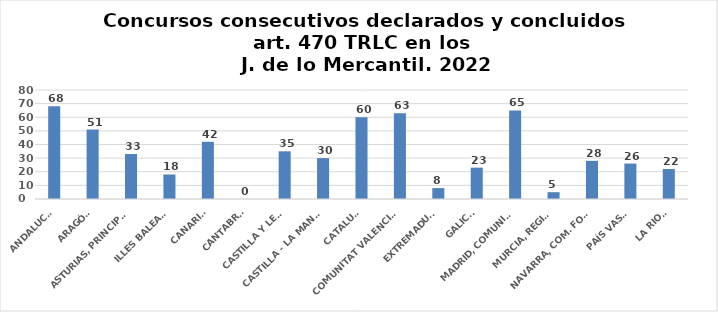
| Category | Series 0 |
|---|---|
| ANDALUCÍA | 68 |
| ARAGÓN | 51 |
| ASTURIAS, PRINCIPADO | 33 |
| ILLES BALEARS | 18 |
| CANARIAS | 42 |
| CANTABRIA | 0 |
| CASTILLA Y LEÓN | 35 |
| CASTILLA - LA MANCHA | 30 |
| CATALUÑA | 60 |
| COMUNITAT VALENCIANA | 63 |
| EXTREMADURA | 8 |
| GALICIA | 23 |
| MADRID, COMUNIDAD | 65 |
| MURCIA, REGIÓN | 5 |
| NAVARRA, COM. FORAL | 28 |
| PAÍS VASCO | 26 |
| LA RIOJA | 22 |